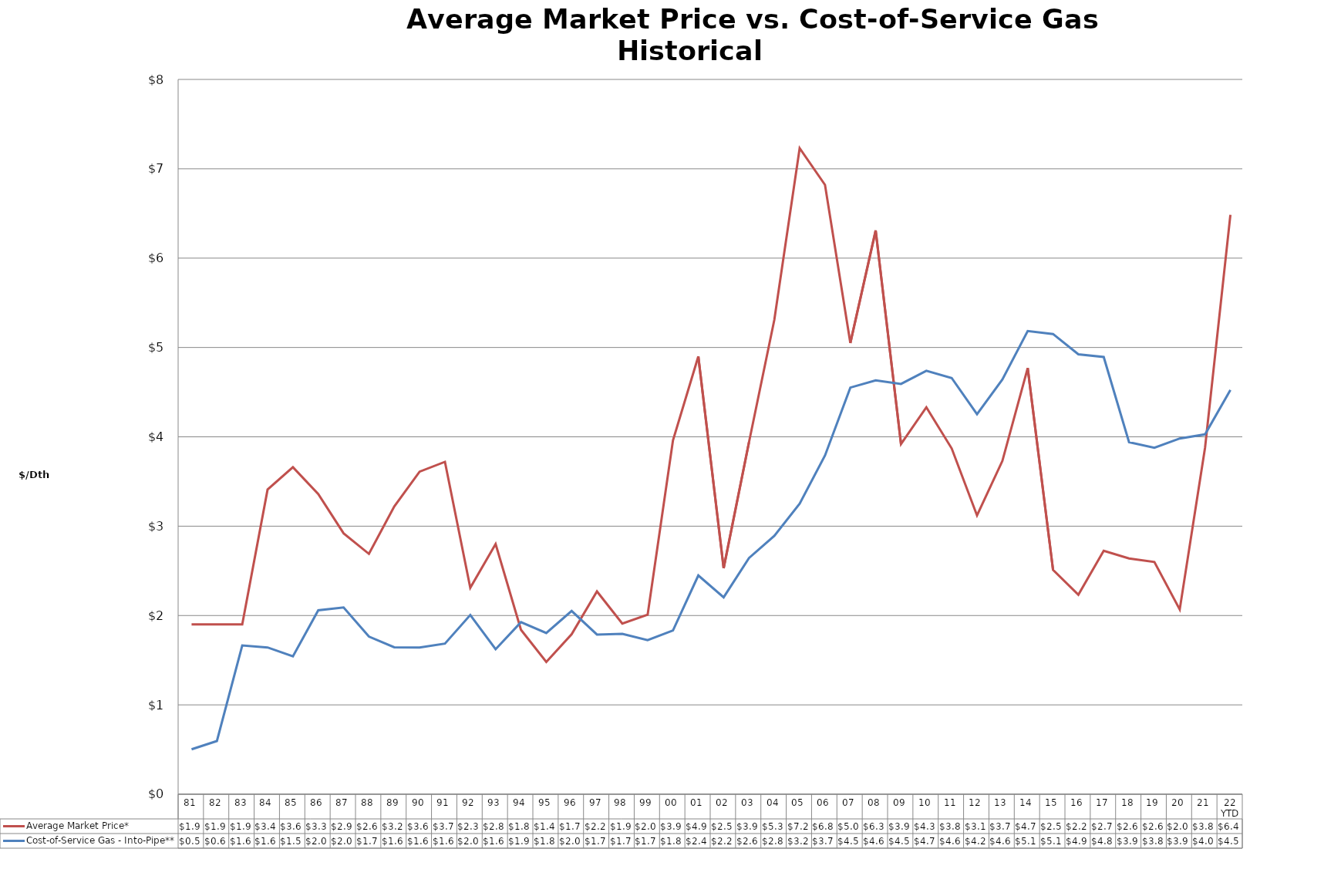
| Category | Average Market Price* | Cost-of-Service Gas - Into-Pipe** |
|---|---|---|
| 81 | 1.9 | 0.502 |
| 82 | 1.9 | 0.596 |
| 83 | 1.9 | 1.665 |
| 84 | 3.41 | 1.643 |
| 85 | 3.66 | 1.543 |
| 86 | 3.36 | 2.059 |
| 87 | 2.92 | 2.091 |
| 88 | 2.69 | 1.764 |
| 89 | 3.22 | 1.644 |
| 90 | 3.61 | 1.642 |
| 91 | 3.72 | 1.685 |
| 92 | 2.31 | 2.005 |
| 93 | 2.8 | 1.623 |
| 94 | 1.84 | 1.926 |
| 95 | 1.48 | 1.804 |
| 96 | 1.79 | 2.052 |
| 97 | 2.27 | 1.787 |
| 98 | 1.91 | 1.795 |
| 99 | 2.01 | 1.725 |
| 00 | 3.96 | 1.833 |
| 01 | 4.9 | 2.448 |
| 02 | 2.53 | 2.204 |
| 03 | 3.94 | 2.644 |
| 04 | 5.31 | 2.891 |
| 05 | 7.23 | 3.251 |
| 06 | 6.82 | 3.792 |
| 07 | 5.05 | 4.551 |
| 08 | 6.31 | 4.632 |
| 09 | 3.92 | 4.592 |
| 10 | 4.33 | 4.74 |
| 11 | 3.87 | 4.658 |
| 12 | 3.12 | 4.253 |
| 13 | 3.73 | 4.641 |
| 14 | 4.77 | 5.184 |
| 15 | 2.51 | 5.151 |
| 16 | 2.233 | 4.923 |
| 17 | 2.725 | 4.894 |
| 18 | 2.639 | 3.94 |
| 19 | 2.599 | 3.877 |
| 20 | 2.067 | 3.981 |
| 21 | 3.88 | 4.027 |
| 22 YTD | 6.485 | 4.523 |